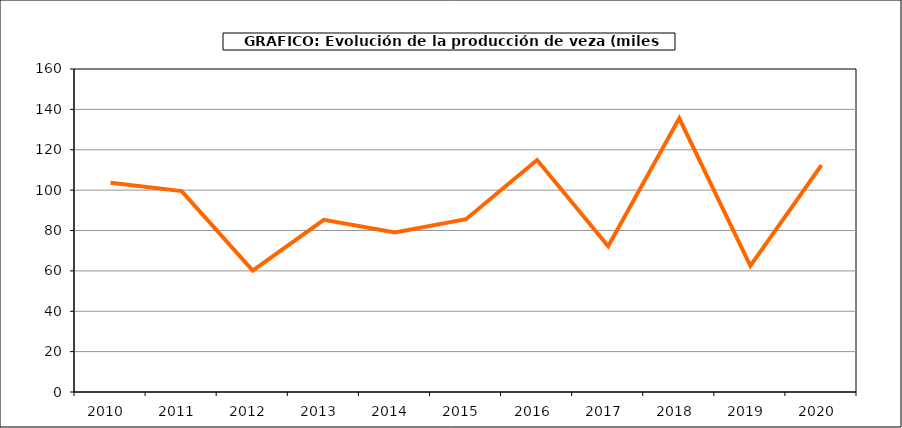
| Category | Producción |
|---|---|
| 2010.0 | 103.681 |
| 2011.0 | 99.503 |
| 2012.0 | 60.1 |
| 2013.0 | 85.3 |
| 2014.0 | 79.043 |
| 2015.0 | 85.595 |
| 2016.0 | 114.932 |
| 2017.0 | 72.231 |
| 2018.0 | 135.569 |
| 2019.0 | 62.468 |
| 2020.0 | 112.403 |